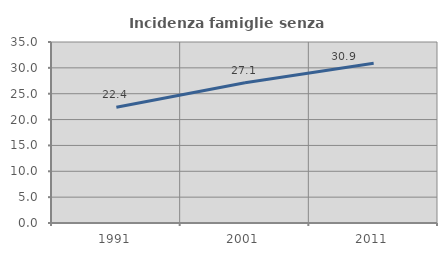
| Category | Incidenza famiglie senza nuclei |
|---|---|
| 1991.0 | 22.376 |
| 2001.0 | 27.125 |
| 2011.0 | 30.898 |